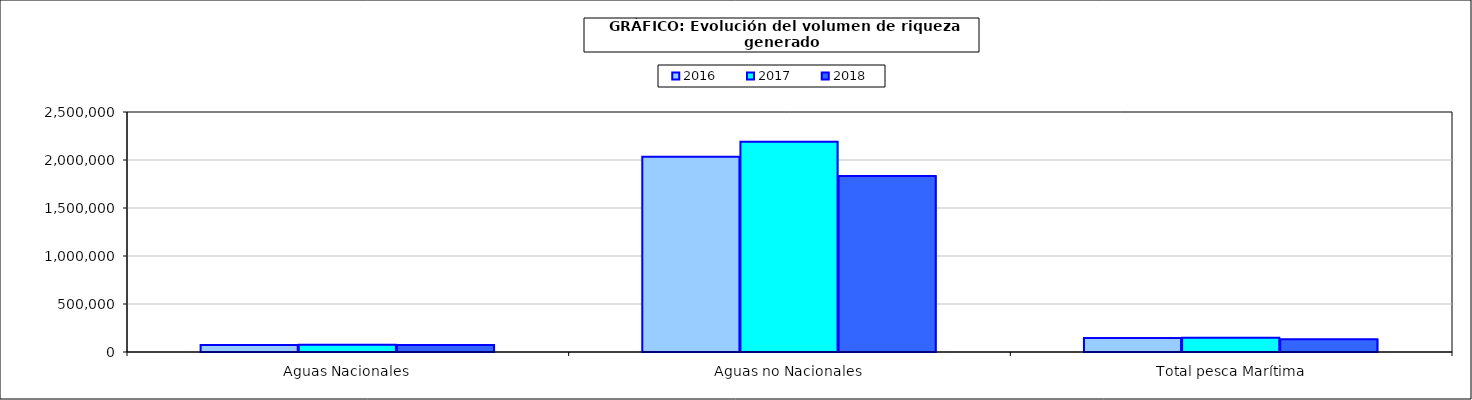
| Category | 2016 | 2017 | 2018 |
|---|---|---|---|
| 0 | 73392.8 | 74797.768 | 71758.407 |
| 1 | 2034075.664 | 2190184.753 | 1832597.322 |
| 2 | 145649.539 | 148783.272 | 133139.433 |